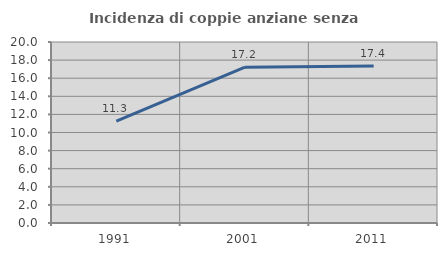
| Category | Incidenza di coppie anziane senza figli  |
|---|---|
| 1991.0 | 11.25 |
| 2001.0 | 17.223 |
| 2011.0 | 17.354 |